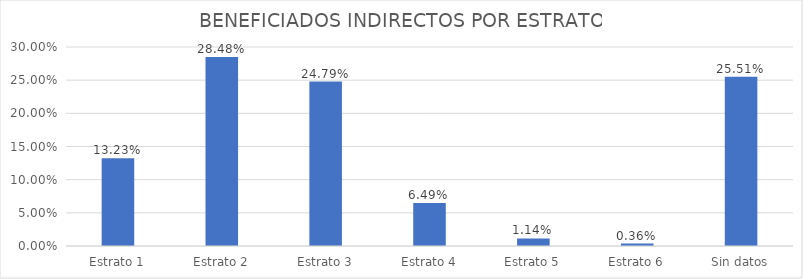
| Category | % |
|---|---|
| Estrato 1 | 0.132 |
| Estrato 2 | 0.285 |
| Estrato 3 | 0.248 |
| Estrato 4 | 0.065 |
| Estrato 5 | 0.011 |
| Estrato 6 | 0.004 |
| Sin datos | 0.255 |